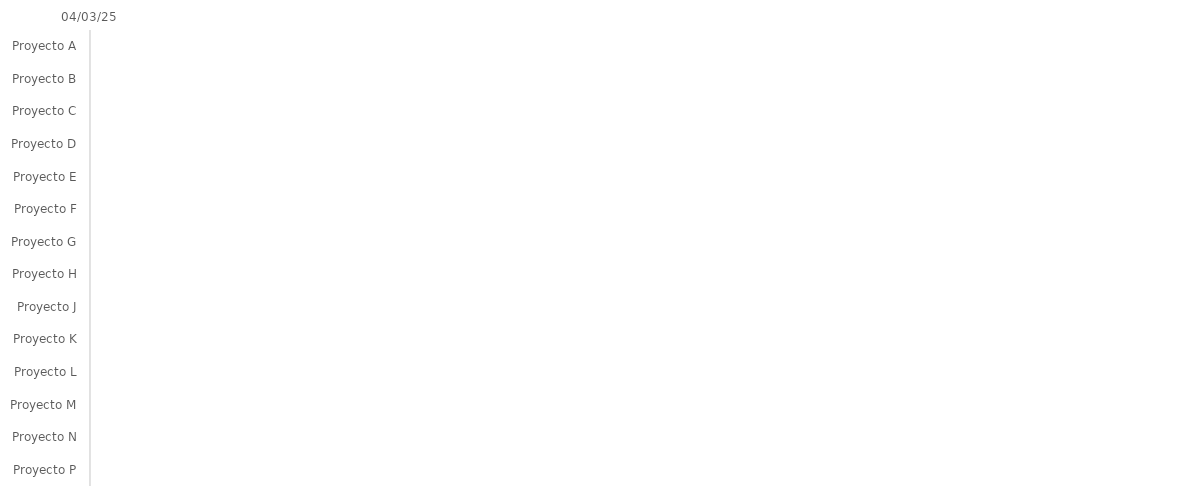
| Category | COMENZAR | Duración |
|---|---|---|
| Proyecto A |  | 0 |
| Proyecto B |  | 0 |
| Proyecto C |  | 0 |
| Proyecto D |  | 0 |
| Proyecto E |  | 0 |
| Proyecto F |  | 0 |
| Proyecto G |  | 0 |
| Proyecto H |  | 0 |
| Proyecto J |  | 0 |
| Proyecto K |  | 0 |
| Proyecto L |  | 0 |
| Proyecto M |  | 0 |
| Proyecto N |  | 0 |
| Proyecto P |  | 0 |